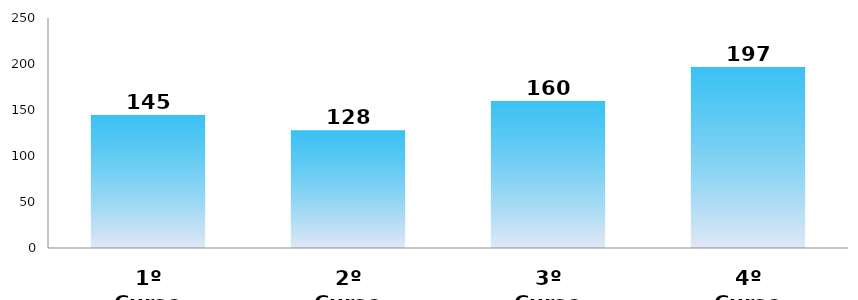
| Category | Series 0 |
|---|---|
| 1º Curso | 145 |
| 2º Curso | 128 |
| 3º Curso | 160 |
| 4º Curso | 197 |